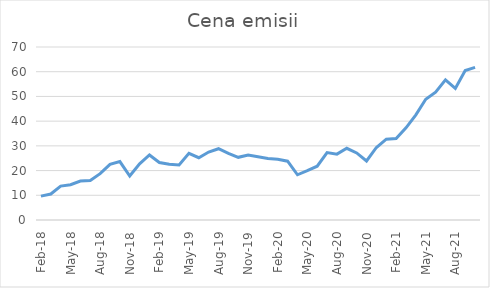
| Category | Series 0 |
|---|---|
| 2018-02-01 | 9.65 |
| 2018-03-01 | 10.51 |
| 2018-04-01 | 13.73 |
| 2018-05-01 | 14.27 |
| 2018-06-01 | 15.76 |
| 2018-07-01 | 16 |
| 2018-08-01 | 18.74 |
| 2018-09-01 | 22.52 |
| 2018-10-01 | 23.63 |
| 2018-11-01 | 17.79 |
| 2018-12-01 | 22.7 |
| 2019-01-01 | 26.3 |
| 2019-02-01 | 23.27 |
| 2019-03-01 | 22.52 |
| 2019-04-01 | 22.3 |
| 2019-05-01 | 26.95 |
| 2019-06-01 | 25.2 |
| 2019-07-01 | 27.5 |
| 2019-08-01 | 28.84 |
| 2019-09-01 | 26.95 |
| 2019-10-01 | 25.36 |
| 2019-11-01 | 26.3 |
| 2019-12-01 | 25.61 |
| 2020-01-01 | 24.86 |
| 2020-02-01 | 24.6 |
| 2020-03-01 | 23.8 |
| 2020-04-01 | 18.3 |
| 2020-05-01 | 19.94 |
| 2020-06-01 | 21.76 |
| 2020-07-01 | 27.27 |
| 2020-08-01 | 26.64 |
| 2020-09-01 | 29.02 |
| 2020-10-01 | 27.14 |
| 2020-11-01 | 23.88 |
| 2020-12-01 | 29.34 |
| 2021-01-01 | 32.72 |
| 2021-02-01 | 32.95 |
| 2021-03-01 | 37.28 |
| 2021-04-01 | 42.55 |
| 2021-05-01 | 48.84 |
| 2021-06-01 | 51.7 |
| 2021-07-01 | 56.68 |
| 2021-08-01 | 53.25 |
| 2021-09-01 | 60.51 |
| 2021-10-01 | 61.75 |